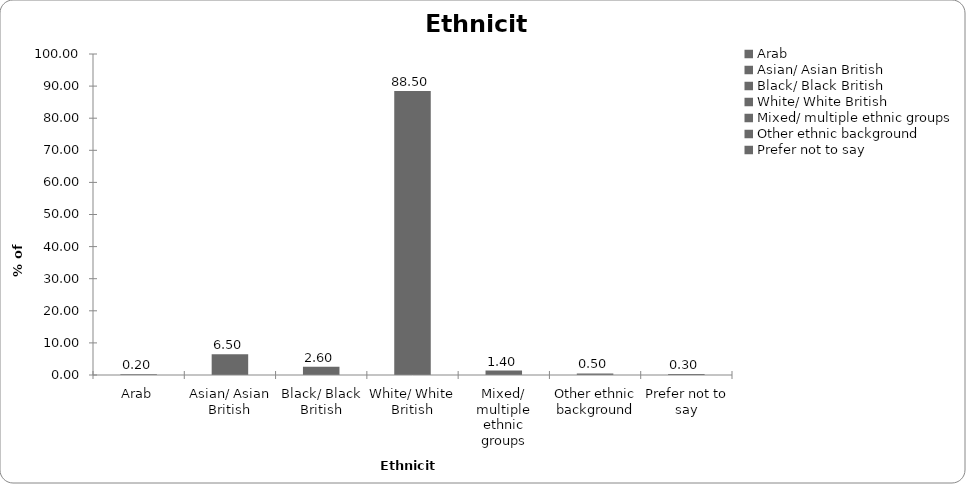
| Category | Ethnicity |
|---|---|
| Arab | 0.2 |
| Asian/ Asian British | 6.5 |
| Black/ Black British | 2.6 |
| White/ White British | 88.5 |
| Mixed/ multiple ethnic groups | 1.4 |
| Other ethnic background | 0.5 |
| Prefer not to say | 0.3 |